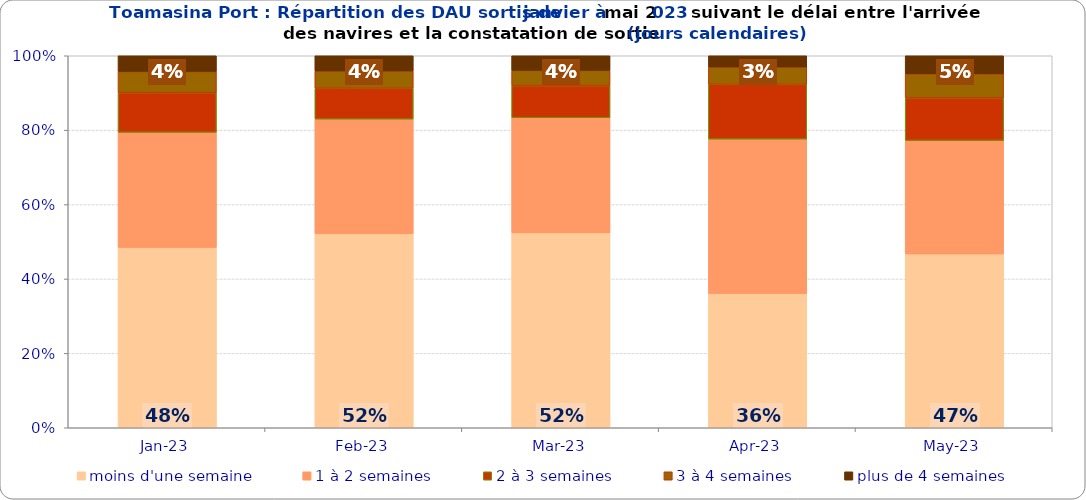
| Category | moins d'une semaine | 1 à 2 semaines | 2 à 3 semaines | 3 à 4 semaines | plus de 4 semaines |
|---|---|---|---|---|---|
| 2023-01-01 | 0.485 | 0.31 | 0.107 | 0.057 | 0.042 |
| 2023-02-01 | 0.521 | 0.309 | 0.083 | 0.047 | 0.041 |
| 2023-03-01 | 0.524 | 0.309 | 0.086 | 0.041 | 0.039 |
| 2023-04-01 | 0.361 | 0.415 | 0.147 | 0.046 | 0.03 |
| 2023-05-01 | 0.467 | 0.305 | 0.115 | 0.064 | 0.049 |